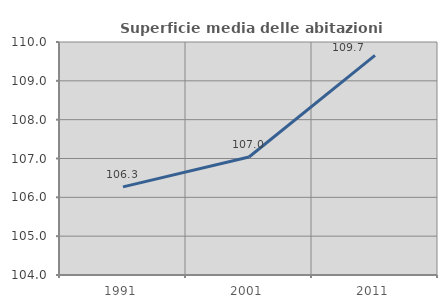
| Category | Superficie media delle abitazioni occupate |
|---|---|
| 1991.0 | 106.268 |
| 2001.0 | 107.039 |
| 2011.0 | 109.654 |